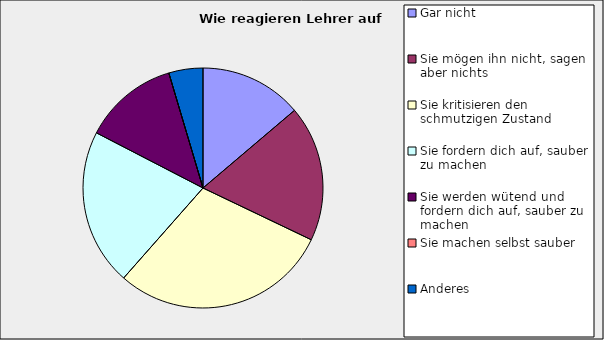
| Category | Series 0 |
|---|---|
| Gar nicht | 0.138 |
| Sie mögen ihn nicht, sagen aber nichts | 0.183 |
| Sie kritisieren den schmutzigen Zustand | 0.294 |
| Sie fordern dich auf, sauber zu machen | 0.211 |
| Sie werden wütend und fordern dich auf, sauber zu machen | 0.128 |
| Sie machen selbst sauber | 0 |
| Anderes | 0.046 |